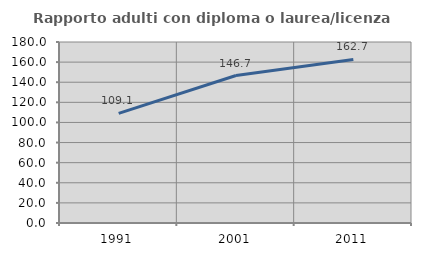
| Category | Rapporto adulti con diploma o laurea/licenza media  |
|---|---|
| 1991.0 | 109.052 |
| 2001.0 | 146.667 |
| 2011.0 | 162.652 |